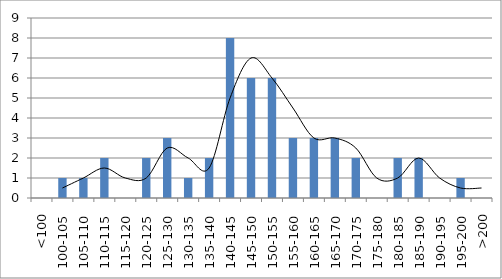
| Category | Series 0 |
|---|---|
| <100 | 0 |
| 100-105 | 1 |
| 105-110 | 1 |
| 110-115 | 2 |
| 115-120 | 0 |
| 120-125 | 2 |
| 125-130 | 3 |
| 130-135 | 1 |
| 135-140 | 2 |
| 140-145 | 8 |
| 145-150 | 6 |
| 150-155 | 6 |
| 155-160 | 3 |
| 160-165 | 3 |
| 165-170 | 3 |
| 170-175 | 2 |
| 175-180 | 0 |
| 180-185 | 2 |
| 185-190 | 2 |
| 190-195 | 0 |
| 195-200 | 1 |
| >200 | 0 |